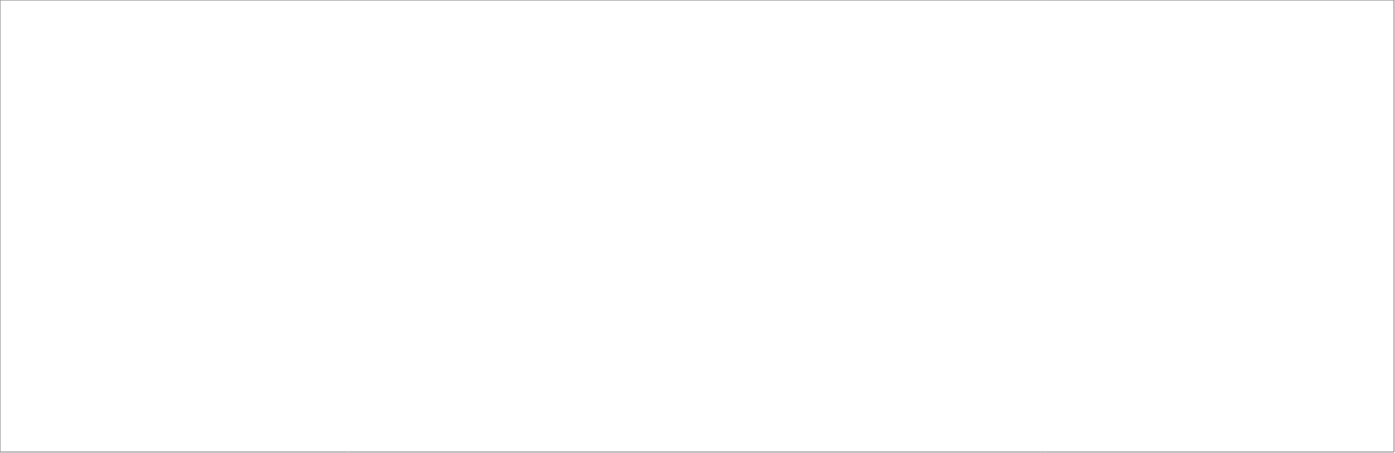
| Category | Servicios de Intermediación Financiera Medidos Indirectamente (SIFMI) |
|---|---|
| 2018_I | -3950.71 |
| 2018_II | -3996.828 |
| 2018_III | -4147.319 |
| 2018_IV | -4366.053 |
| 2019_I | -4366.629 |
| 2019_II | -4508.141 |
| 2019_III | 0 |
| 2019_IV | 0 |